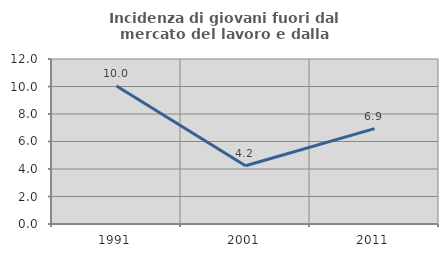
| Category | Incidenza di giovani fuori dal mercato del lavoro e dalla formazione  |
|---|---|
| 1991.0 | 10.04 |
| 2001.0 | 4.233 |
| 2011.0 | 6.936 |